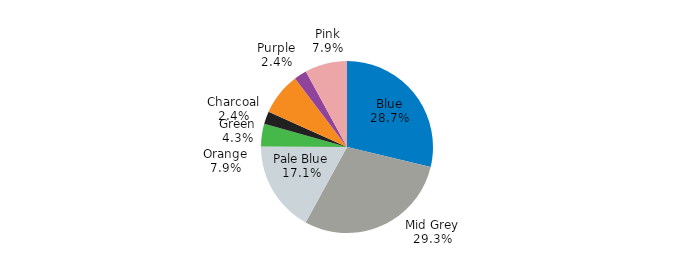
| Category | 1975-76 |
|---|---|
| Blue | 36.19 |
| Mid Grey | 36.88 |
| Pale Blue | 21.56 |
| Green | 5.36 |
| Charcoal | 3.01 |
| Orange | 10 |
| Purple | 3.01 |
| Pink | 10 |